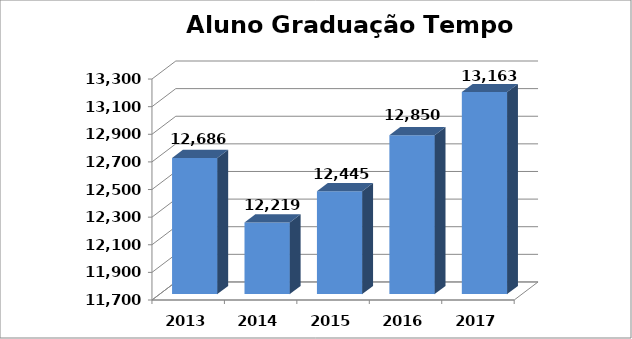
| Category | Series 0 |
|---|---|
| 2013.0 | 12686.11 |
| 2014.0 | 12218.531 |
| 2015.0 | 12445.014 |
| 2016.0 | 12850.16 |
| 2017.0 | 13162.846 |